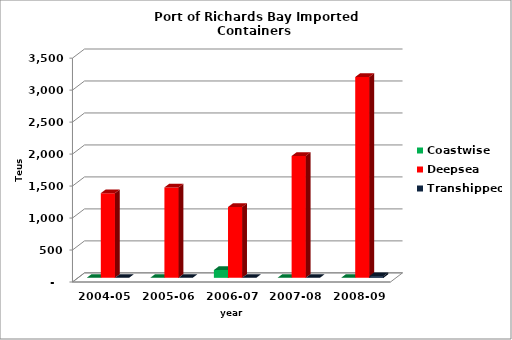
| Category | Coastwise | Deepsea | Transhipped |
|---|---|---|---|
| 2004-05 | 0 | 1324 | 0 |
| 2005-06 | 0 | 1414 | 0 |
| 2006-07 | 122 | 1107 | 0 |
| 2007-08 | 0 | 1905 | 0 |
| 2008-09 | 0 | 3140 | 27 |